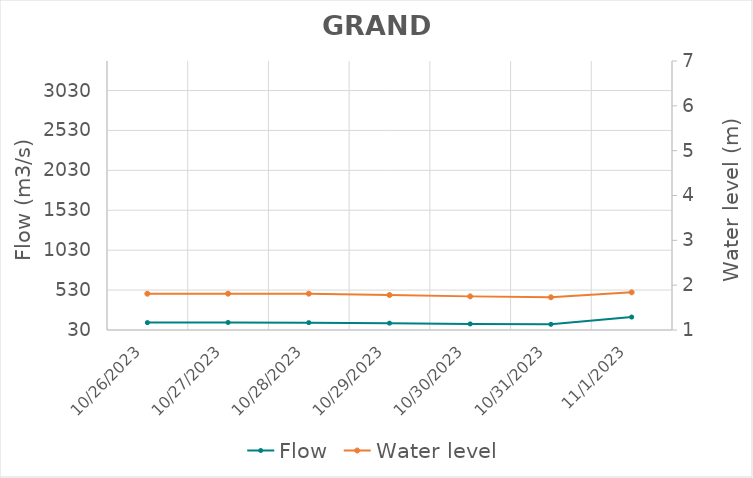
| Category | Flow |
|---|---|
| 7/20/23 | 999.44 |
| 7/19/23 | 998.2 |
| 7/18/23 | 953.77 |
| 7/17/23 | 940.79 |
| 7/16/23 | 942.35 |
| 7/15/23 | 953.14 |
| 7/14/23 | 1006.64 |